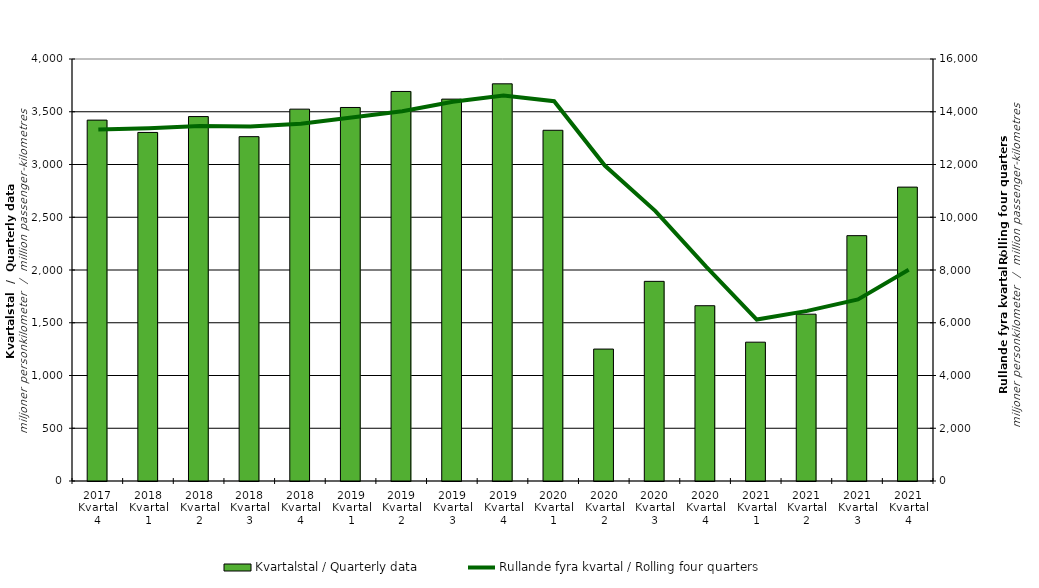
| Category | Kvartalstal / Quarterly data |
|---|---|
| 2017 Kvartal 4 | 3420.641 |
| 2018 Kvartal 1 | 3303.883 |
| 2018 Kvartal 2 | 3454.255 |
| 2018 Kvartal 3 | 3264.066 |
| 2018 Kvartal 4 | 3524.594 |
| 2019 Kvartal 1 | 3540.48 |
| 2019 Kvartal 2 | 3692.248 |
| 2019 Kvartal 3 | 3619.721 |
| 2019 Kvartal 4 | 3764.759 |
| 2020 Kvartal 1 | 3324.383 |
| 2020 Kvartal 2 | 1250.488 |
| 2020 Kvartal 3 | 1892.351 |
| 2020 Kvartal 4 | 1661.523 |
| 2021 Kvartal 1 | 1315.837 |
| 2021 Kvartal 2 | 1581.257 |
| 2021 Kvartal 3 | 2325.544 |
| 2021 Kvartal 4 | 2785.558 |